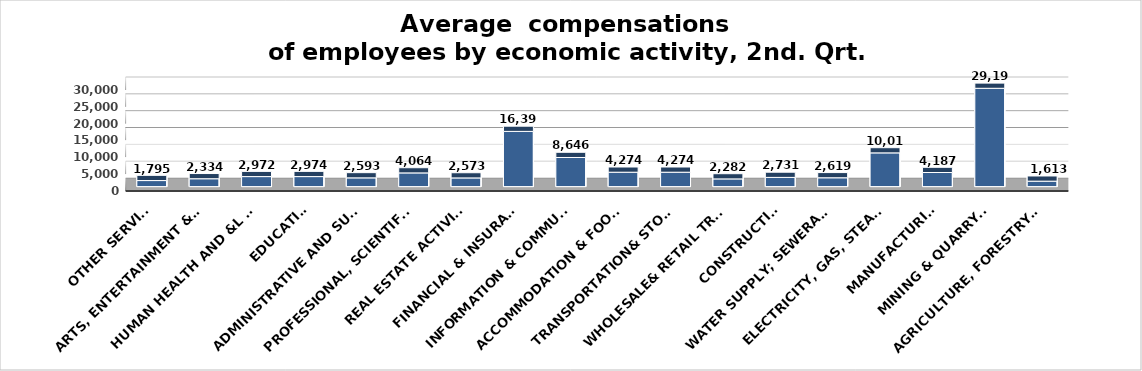
| Category | متوسط التعويضات  |
|---|---|
| Agriculture, forestry & fishing | 1612.684 |
| Mining & quarrying | 29197.648 |
| Manufacturing | 4186.655 |
| Electricity, gas, steam & air conditioning supply | 10011.646 |
| Water supply; sewerage, waste remediation  | 2619.487 |
| Construction | 2730.655 |
| Wholesale& retail trade; repair of motor vehicles | 2282.347 |
| Transportation& storage | 4273.649 |
| Accommodation & food service activities | 4273.649 |
| Information & communication | 8646.486 |
| Financial & insurance | 16398.479 |
| Real estate activities | 2573.198 |
| Professional, scientific & technical activities | 4063.69 |
| Administrative and support service activities | 2593.479 |
| Education | 2973.655 |
| Human health and &l work activities | 2971.646 |
| Arts, entertainment & recreation | 2334 |
| Other service | 1794.852 |